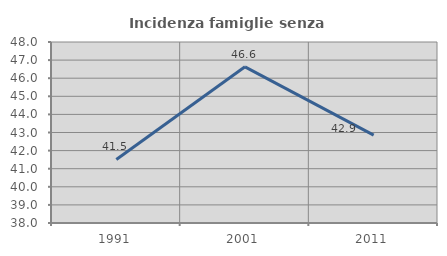
| Category | Incidenza famiglie senza nuclei |
|---|---|
| 1991.0 | 41.509 |
| 2001.0 | 46.629 |
| 2011.0 | 42.857 |